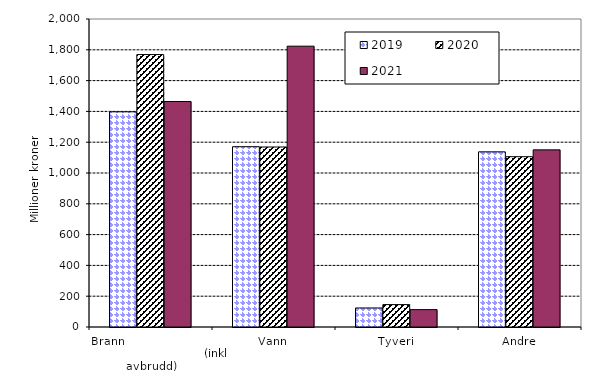
| Category | 2019 | 2020 | 2021 |
|---|---|---|---|
| Brann                                                       (inkl avbrudd) | 1397.416 | 1769.074 | 1464.198 |
| Vann | 1170.779 | 1168.864 | 1823.524 |
| Tyveri | 123.671 | 145.453 | 112.873 |
| Andre | 1137.426 | 1105.888 | 1150.229 |